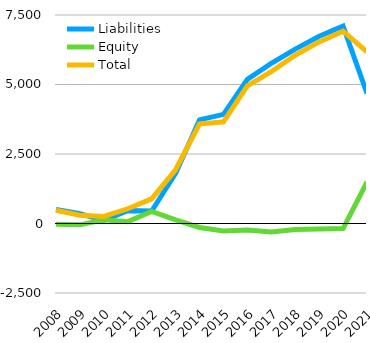
| Category | Liabilities  | Equity  | Total |
|---|---|---|---|
| 2008 | 508 | -30 | 478 |
| 2009 | 349 | -49 | 300 |
| 2010 | 116 | 136 | 252 |
| 2011 | 463 | 67 | 530 |
| 2012 | 450 | 437 | 887 |
| 2013 | 1806 | 127 | 1933 |
| 2014 | 3726 | -144 | 3582 |
| 2015 | 3926 | -272 | 3654 |
| 2016 | 5184 | -232 | 4952 |
| 2017 | 5763 | -304 | 5459 |
| 2018 | 6272 | -219 | 6053 |
| 2019 | 6733 | -200 | 6533 |
| 2020 | 7099 | -181 | 6918 |
| 2021 | 4679 | 1493 | 6172 |